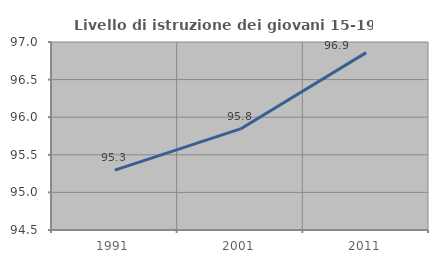
| Category | Livello di istruzione dei giovani 15-19 anni |
|---|---|
| 1991.0 | 95.297 |
| 2001.0 | 95.844 |
| 2011.0 | 96.859 |